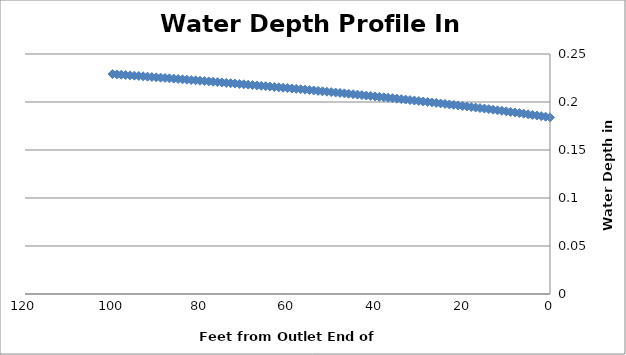
| Category | Water Depth |
|---|---|
| 0.0 | 0.184 |
| 1.0 | 0.185 |
| 2.0 | 0.185 |
| 3.0 | 0.186 |
| 4.0 | 0.187 |
| 5.0 | 0.187 |
| 6.0 | 0.188 |
| 7.0 | 0.188 |
| 8.0 | 0.189 |
| 9.0 | 0.19 |
| 10.0 | 0.19 |
| 11.0 | 0.191 |
| 12.0 | 0.191 |
| 13.0 | 0.192 |
| 14.0 | 0.193 |
| 15.0 | 0.193 |
| 16.0 | 0.194 |
| 17.0 | 0.194 |
| 18.0 | 0.195 |
| 19.0 | 0.195 |
| 20.0 | 0.196 |
| 21.0 | 0.196 |
| 22.0 | 0.197 |
| 23.0 | 0.197 |
| 24.0 | 0.198 |
| 25.0 | 0.199 |
| 26.0 | 0.199 |
| 27.0 | 0.2 |
| 28.0 | 0.2 |
| 29.0 | 0.201 |
| 30.0 | 0.201 |
| 31.0 | 0.202 |
| 32.0 | 0.202 |
| 33.0 | 0.203 |
| 34.0 | 0.203 |
| 35.0 | 0.203 |
| 36.0 | 0.204 |
| 37.0 | 0.204 |
| 38.0 | 0.205 |
| 39.0 | 0.205 |
| 40.0 | 0.206 |
| 41.0 | 0.206 |
| 42.0 | 0.207 |
| 43.0 | 0.207 |
| 44.0 | 0.208 |
| 45.0 | 0.208 |
| 46.0 | 0.209 |
| 47.0 | 0.209 |
| 48.0 | 0.209 |
| 49.0 | 0.21 |
| 50.0 | 0.21 |
| 51.0 | 0.211 |
| 52.0 | 0.211 |
| 53.0 | 0.212 |
| 54.0 | 0.212 |
| 55.0 | 0.212 |
| 56.0 | 0.213 |
| 57.0 | 0.213 |
| 58.0 | 0.214 |
| 59.0 | 0.214 |
| 60.0 | 0.214 |
| 61.0 | 0.215 |
| 62.0 | 0.215 |
| 63.0 | 0.216 |
| 64.0 | 0.216 |
| 65.0 | 0.216 |
| 66.0 | 0.217 |
| 67.0 | 0.217 |
| 68.0 | 0.218 |
| 69.0 | 0.218 |
| 70.0 | 0.218 |
| 71.0 | 0.219 |
| 72.0 | 0.219 |
| 73.0 | 0.22 |
| 74.0 | 0.22 |
| 75.0 | 0.22 |
| 76.0 | 0.221 |
| 77.0 | 0.221 |
| 78.0 | 0.221 |
| 79.0 | 0.222 |
| 80.0 | 0.222 |
| 81.0 | 0.223 |
| 82.0 | 0.223 |
| 83.0 | 0.223 |
| 84.0 | 0.224 |
| 85.0 | 0.224 |
| 86.0 | 0.224 |
| 87.0 | 0.225 |
| 88.0 | 0.225 |
| 89.0 | 0.225 |
| 90.0 | 0.226 |
| 91.0 | 0.226 |
| 92.0 | 0.226 |
| 93.0 | 0.227 |
| 94.0 | 0.227 |
| 95.0 | 0.227 |
| 96.0 | 0.228 |
| 97.0 | 0.228 |
| 98.0 | 0.228 |
| 99.0 | 0.229 |
| 100.0 | 0.229 |